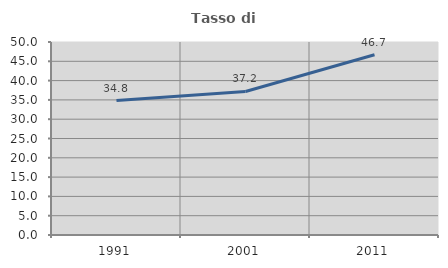
| Category | Tasso di occupazione   |
|---|---|
| 1991.0 | 34.837 |
| 2001.0 | 37.176 |
| 2011.0 | 46.68 |